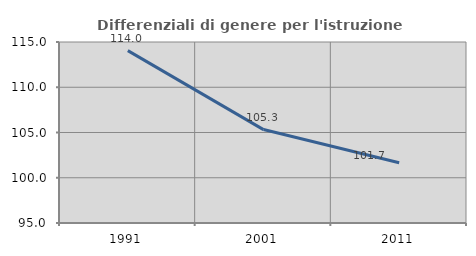
| Category | Differenziali di genere per l'istruzione superiore |
|---|---|
| 1991.0 | 114.042 |
| 2001.0 | 105.323 |
| 2011.0 | 101.657 |